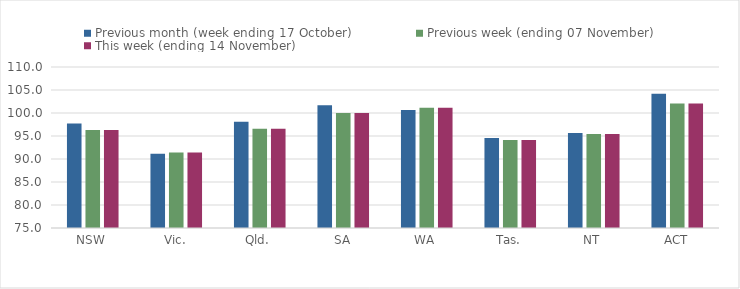
| Category | Previous month (week ending 17 October) | Previous week (ending 07 November) | This week (ending 14 November) |
|---|---|---|---|
| NSW | 97.73 | 96.28 | 96.28 |
| Vic. | 91.15 | 91.43 | 91.43 |
| Qld. | 98.12 | 96.6 | 96.6 |
| SA | 101.69 | 99.99 | 99.99 |
| WA | 100.65 | 101.12 | 101.12 |
| Tas. | 94.56 | 94.14 | 94.14 |
| NT | 95.67 | 95.45 | 95.45 |
| ACT | 104.21 | 102.04 | 102.04 |